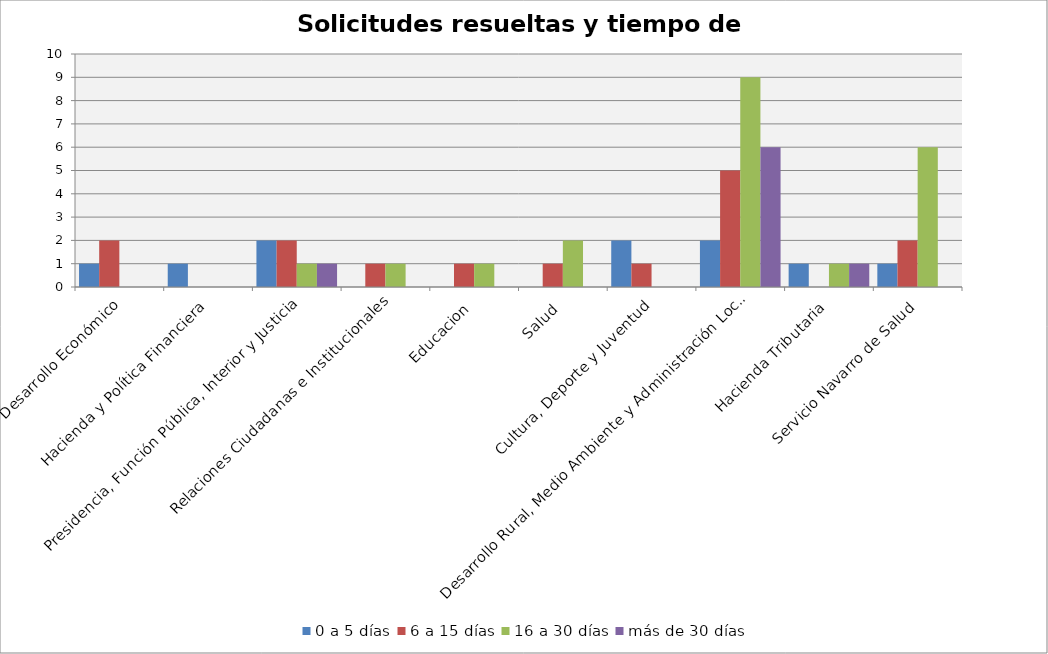
| Category | 0 a 5 días | 6 a 15 días | 16 a 30 días | más de 30 días |
|---|---|---|---|---|
| Desarrollo Económico | 1 | 2 | 0 | 0 |
| Hacienda y Política Financiera | 1 | 0 | 0 | 0 |
| Presidencia, Función Pública, Interior y Justicia | 2 | 2 | 1 | 1 |
| Relaciones Ciudadanas e Institucionales | 0 | 1 | 1 | 0 |
| Educacion | 0 | 1 | 1 | 0 |
| Salud | 0 | 1 | 2 | 0 |
| Cultura, Deporte y Juventud | 2 | 1 | 0 | 0 |
| Desarrollo Rural, Medio Ambiente y Administración Local | 2 | 5 | 9 | 6 |
| Hacienda Tributaria | 1 | 0 | 1 | 1 |
| Servicio Navarro de Salud | 1 | 2 | 6 | 0 |